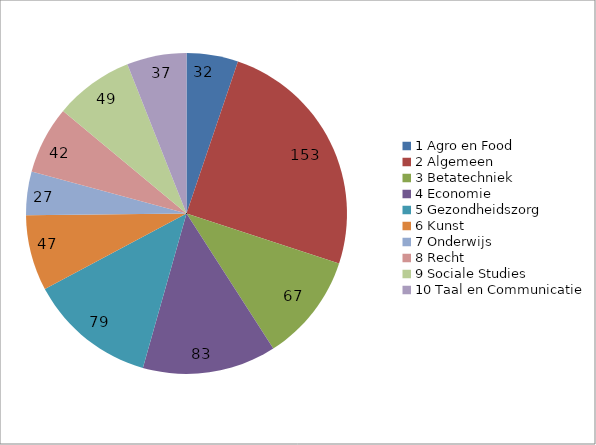
| Category | Series 0 |
|---|---|
| 0 | 32 |
| 1 | 153 |
| 2 | 67 |
| 3 | 83 |
| 4 | 79 |
| 5 | 47 |
| 6 | 27 |
| 7 | 42 |
| 8 | 49 |
| 9 | 37 |